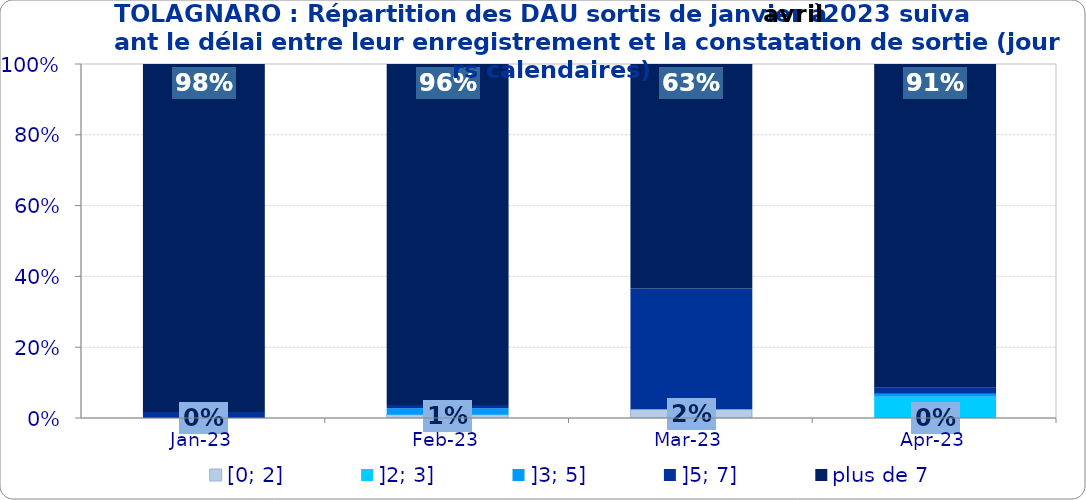
| Category | [0; 2] | ]2; 3] | ]3; 5] | ]5; 7] | plus de 7 |
|---|---|---|---|---|---|
| 2023-01-01 | 0 | 0 | 0 | 0.017 | 0.983 |
| 2023-02-01 | 0.009 | 0 | 0.019 | 0.009 | 0.963 |
| 2023-03-01 | 0.024 | 0 | 0 | 0.341 | 0.634 |
| 2023-04-01 | 0 | 0.06 | 0.009 | 0.017 | 0.915 |